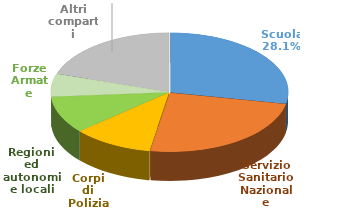
| Category | Series 0 |
|---|---|
| Scuola | 50613443228 |
| Servizio Sanitario Nazionale | 44292247397 |
| Corpi di Polizia | 19743442746 |
| Regioni ed autonomie locali | 18219329037 |
| Forze Armate | 11151124055 |
| Altri comparti | 36184768582 |